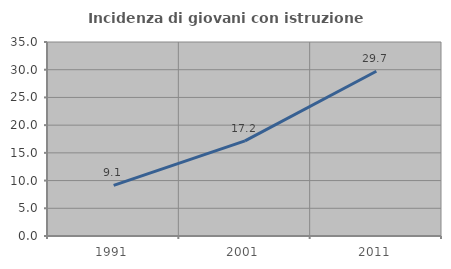
| Category | Incidenza di giovani con istruzione universitaria |
|---|---|
| 1991.0 | 9.132 |
| 2001.0 | 17.164 |
| 2011.0 | 29.73 |